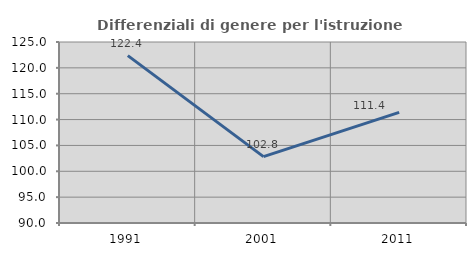
| Category | Differenziali di genere per l'istruzione superiore |
|---|---|
| 1991.0 | 122.368 |
| 2001.0 | 102.837 |
| 2011.0 | 111.38 |